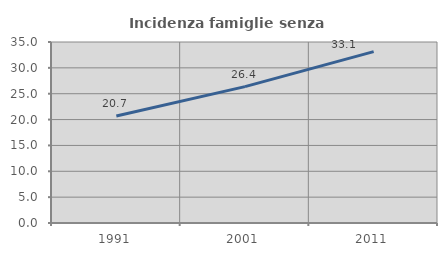
| Category | Incidenza famiglie senza nuclei |
|---|---|
| 1991.0 | 20.701 |
| 2001.0 | 26.372 |
| 2011.0 | 33.143 |